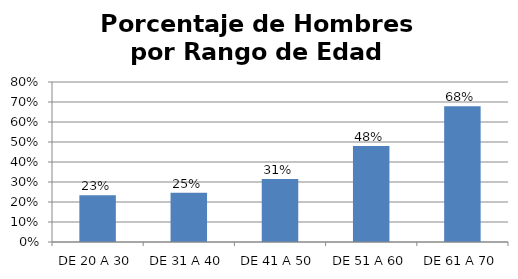
| Category | Porcentaje |
|---|---|
| DE 20 A 30 | 0.233 |
| DE 31 A 40 | 0.246 |
| DE 41 A 50 | 0.315 |
| DE 51 A 60 | 0.48 |
| DE 61 A 70 | 0.679 |